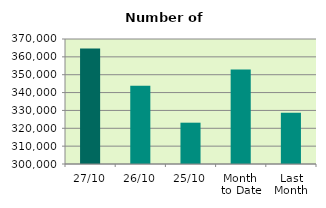
| Category | Series 0 |
|---|---|
| 27/10 | 364748 |
| 26/10 | 343784 |
| 25/10 | 323134 |
| Month 
to Date | 352955.789 |
| Last
Month | 328669.364 |